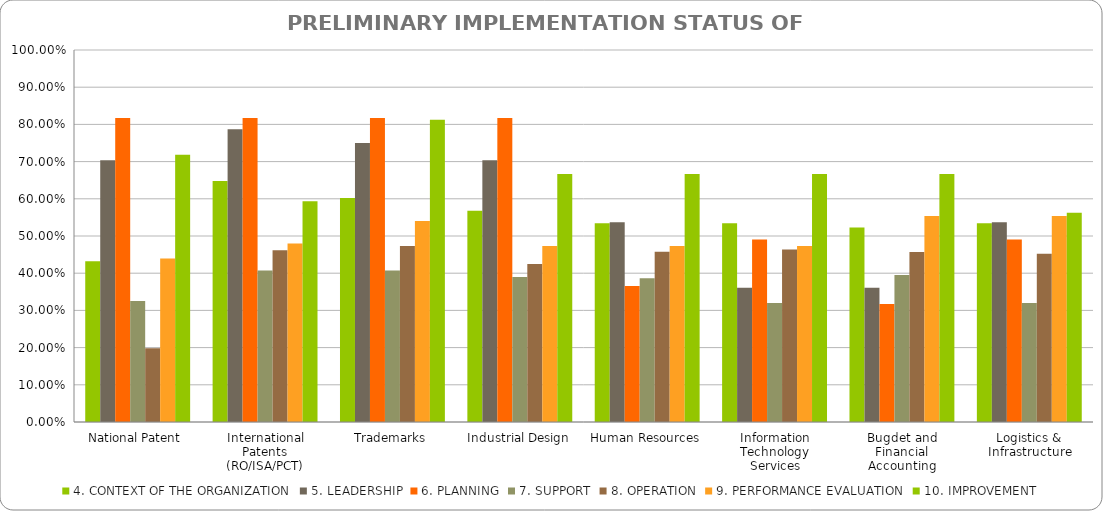
| Category | 4. CONTEXT OF THE ORGANIZATION | 5. LEADERSHIP | 6. PLANNING | 7. SUPPORT | 8. OPERATION | 9. PERFORMANCE EVALUATION | 10. IMPROVEMENT |
|---|---|---|---|---|---|---|---|
| National Patent  | 0.432 | 0.704 | 0.817 | 0.326 | 0.198 | 0.439 | 0.719 |
| International Patents (RO/ISA/PCT) | 0.648 | 0.787 | 0.817 | 0.407 | 0.462 | 0.48 | 0.594 |
| Trademarks | 0.602 | 0.75 | 0.817 | 0.407 | 0.473 | 0.541 | 0.812 |
| Industrial Design | 0.568 | 0.704 | 0.817 | 0.39 | 0.424 | 0.473 | 0.667 |
| Human Resources | 0.534 | 0.537 | 0.365 | 0.386 | 0.457 | 0.473 | 0.667 |
| Information Technology Services | 0.534 | 0.361 | 0.491 | 0.32 | 0.463 | 0.473 | 0.667 |
| Bugdet and Financial Accounting | 0.523 | 0.361 | 0.317 | 0.395 | 0.457 | 0.554 | 0.667 |
| Logistics & Infrastructure | 0.534 | 0.537 | 0.49 | 0.32 | 0.452 | 0.554 | 0.562 |